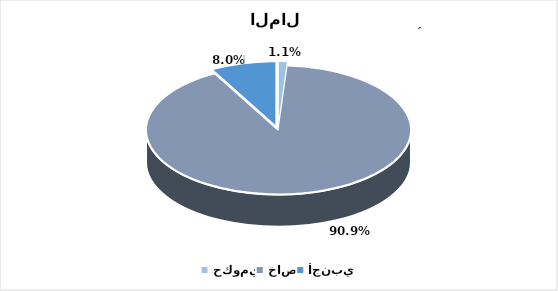
| Category |  النسبة  Percentage |
|---|---|
| حكومي | 0.011 |
| خاص | 0.909 |
| أجنبي | 0.08 |